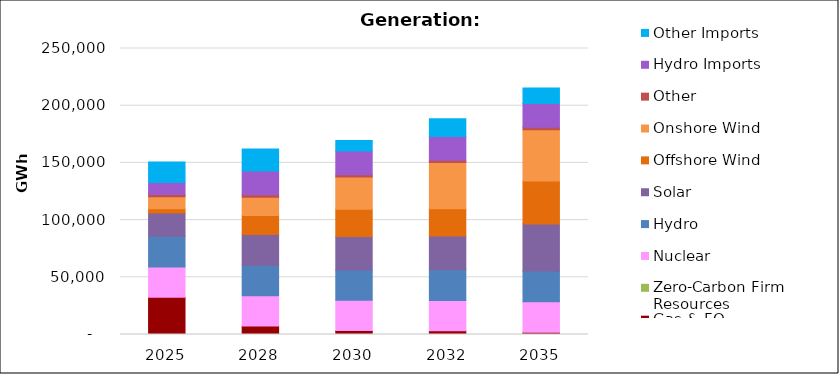
| Category | Gas & FO | Zero-Carbon Firm Resources | Nuclear | Hydro | Solar | Offshore Wind | Onshore Wind | Other | Hydro Imports | Other Imports |
|---|---|---|---|---|---|---|---|---|---|---|
| 2025.0 | 32519.59 | 0 | 26550.05 | 26793.11 | 20416.26 | 3560.16 | 10545.91 | 2085 | 10361.35 | 17981.79 |
| 2028.0 | 7371.51 | 0 | 26550.05 | 26717.75 | 26771.96 | 16567.84 | 16061.57 | 2085 | 20763.85 | 19353.64 |
| 2030.0 | 3393.29 | 0 | 26550.05 | 26380.49 | 29315.97 | 23788.54 | 28169.66 | 2081.17 | 20763.85 | 9091.16 |
| 2032.0 | 3234.56 | 0 | 26550.05 | 26778.53 | 29539.59 | 23788.54 | 40388.57 | 2085 | 20763.85 | 15545.26 |
| 2035.0 | 2068.78 | 0 | 26550.05 | 26911 | 41063.63 | 37562.44 | 44875.36 | 2085 | 20763.85 | 13503.32 |